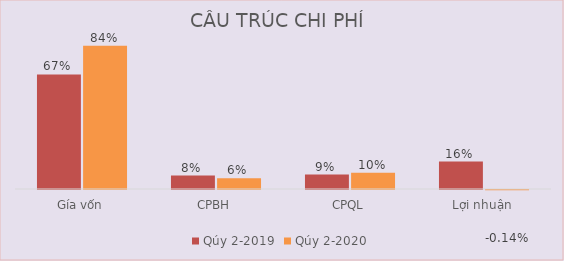
| Category | Qúy 2-2019 | Qúy 2-2020 |
|---|---|---|
| Gía vốn | 0.674 | 0.843 |
| CPBH | 0.079 | 0.063 |
| CPQL | 0.085 | 0.096 |
| Lợi nhuận | 0.162 | -0.001 |